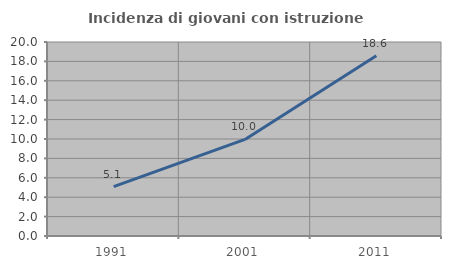
| Category | Incidenza di giovani con istruzione universitaria |
|---|---|
| 1991.0 | 5.089 |
| 2001.0 | 9.954 |
| 2011.0 | 18.593 |